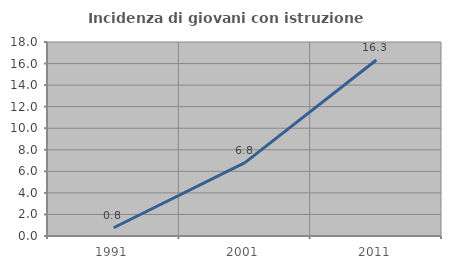
| Category | Incidenza di giovani con istruzione universitaria |
|---|---|
| 1991.0 | 0.763 |
| 2001.0 | 6.803 |
| 2011.0 | 16.327 |